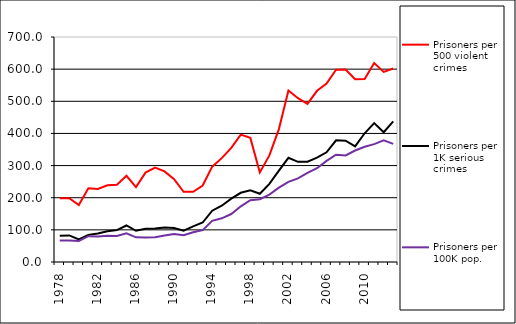
| Category | Prisoners per 500 violent crimes | Prisoners per 1K serious crimes | Prisoners per 100K pop. |
|---|---|---|---|
| 1978.0 | 198.237 | 81.494 | 66.505 |
| 1979.0 | 198.194 | 82.765 | 66.613 |
| 1980.0 | 177.192 | 70.598 | 65.103 |
| 1981.0 | 229.472 | 84.449 | 80.215 |
| 1982.0 | 227.166 | 88.959 | 79.415 |
| 1983.0 | 238.667 | 95.722 | 81.985 |
| 1984.0 | 240.481 | 99.109 | 80.891 |
| 1985.0 | 268.357 | 113.591 | 89.101 |
| 1986.0 | 233.207 | 97.13 | 76.707 |
| 1987.0 | 278.119 | 103.095 | 76.384 |
| 1988.0 | 293.821 | 104.033 | 77.229 |
| 1989.0 | 281.938 | 106.971 | 82.714 |
| 1990.0 | 257.74 | 105.593 | 87.261 |
| 1991.0 | 218.314 | 97.223 | 83.398 |
| 1992.0 | 218.367 | 110.714 | 92.384 |
| 1993.0 | 237.938 | 122.814 | 99.176 |
| 1994.0 | 296.617 | 159.682 | 127.991 |
| 1995.0 | 323.139 | 175.217 | 135.832 |
| 1996.0 | 355.188 | 197.249 | 149.233 |
| 1997.0 | 396.374 | 215.351 | 173.348 |
| 1998.0 | 386.187 | 222.763 | 192.049 |
| 1999.0 | 278.725 | 212.272 | 195.47 |
| 2000.0 | 331.557 | 243.067 | 209.861 |
| 2001.0 | 413.505 | 284.504 | 231.208 |
| 2002.0 | 533.523 | 324.075 | 249.545 |
| 2003.0 | 509.509 | 311.736 | 260.29 |
| 2004.0 | 491.781 | 312.096 | 277.289 |
| 2005.0 | 532.609 | 324.623 | 291.718 |
| 2006.0 | 555.458 | 341.249 | 314.495 |
| 2007.0 | 598.437 | 378.512 | 333.824 |
| 2008.0 | 598.667 | 377.58 | 331.649 |
| 2009.0 | 568.329 | 359.531 | 346.911 |
| 2010.0 | 569.64 | 400.458 | 358.447 |
| 2011.0 | 618.792 | 432.156 | 366.757 |
| 2012.0 | 591.2 | 403.642 | 378.471 |
| 2013.0 | 602.086 | 437.649 | 367.502 |